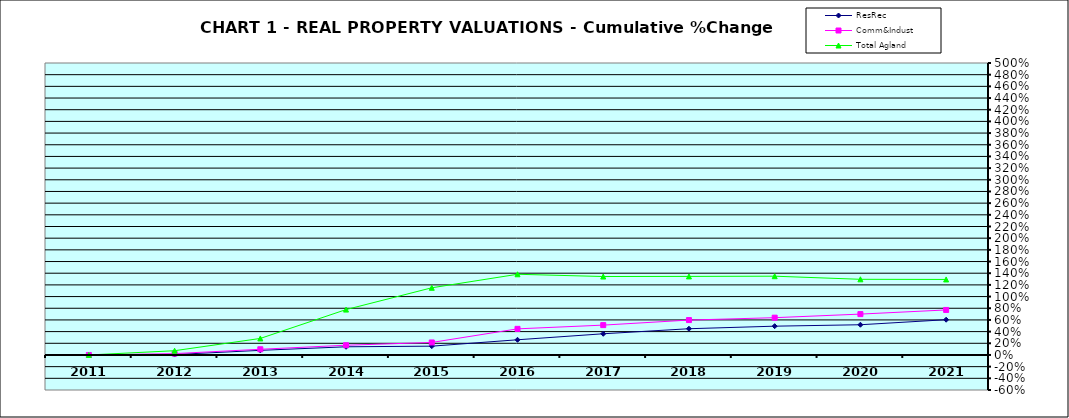
| Category | ResRec | Comm&Indust | Total Agland |
|---|---|---|---|
| 2011.0 | 0 | 0 | 0 |
| 2012.0 | 0.007 | 0.023 | 0.073 |
| 2013.0 | 0.079 | 0.097 | 0.283 |
| 2014.0 | 0.14 | 0.167 | 0.777 |
| 2015.0 | 0.151 | 0.214 | 1.15 |
| 2016.0 | 0.26 | 0.447 | 1.382 |
| 2017.0 | 0.363 | 0.511 | 1.343 |
| 2018.0 | 0.449 | 0.598 | 1.345 |
| 2019.0 | 0.493 | 0.638 | 1.349 |
| 2020.0 | 0.518 | 0.7 | 1.296 |
| 2021.0 | 0.604 | 0.771 | 1.293 |